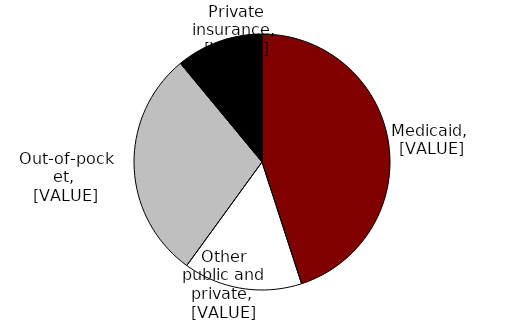
| Category | Series 0 |
|---|---|
| Medicaid | 0.45 |
| Other public and private | 0.15 |
| Out-of-pocket | 0.29 |
| Private insurance | 0.11 |